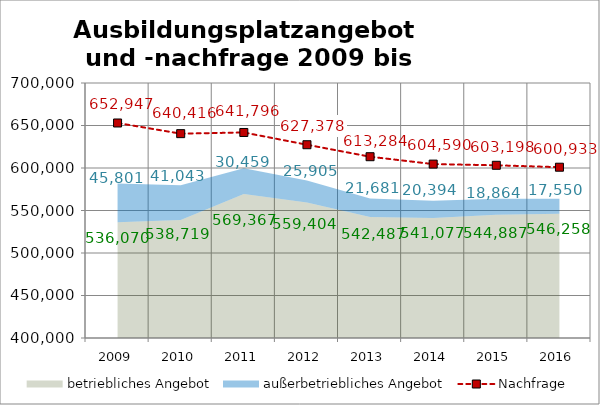
| Category | Nachfrage |
|---|---|
| 2009.0 | 652947 |
| 2010.0 | 640416 |
| 2011.0 | 641796 |
| 2012.0 | 627378 |
| 2013.0 | 613284 |
| 2014.0 | 604590 |
| 2015.0 | 603198 |
| 2016.0 | 600933 |